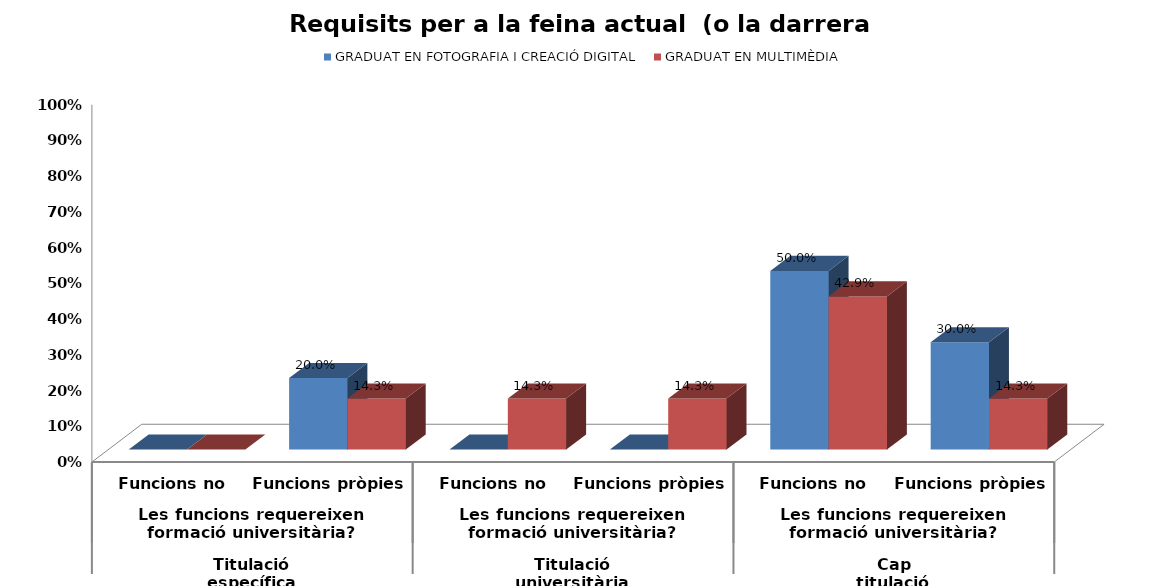
| Category | GRADUAT EN FOTOGRAFIA I CREACIÓ DIGITAL | GRADUAT EN MULTIMÈDIA |
|---|---|---|
| 0 | 0 | 0 |
| 1 | 0.2 | 0.143 |
| 2 | 0 | 0.143 |
| 3 | 0 | 0.143 |
| 4 | 0.5 | 0.429 |
| 5 | 0.3 | 0.143 |